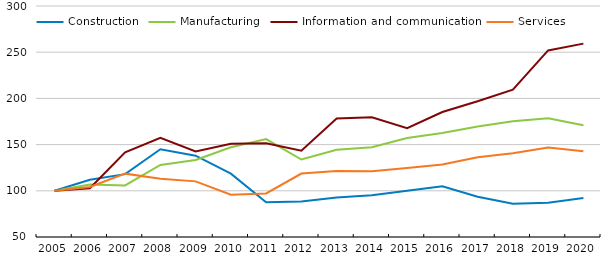
| Category | Construction | Manufacturing | Information and communication | Services |
|---|---|---|---|---|
| 2005.0 | 100 | 100 | 100 | 100 |
| 2006.0 | 111.855 | 106.706 | 102.7 | 104.203 |
| 2007.0 | 118.05 | 105.843 | 141.595 | 118.567 |
| 2008.0 | 144.94 | 128.044 | 157.216 | 112.927 |
| 2009.0 | 138.014 | 133.283 | 142.652 | 110.209 |
| 2010.0 | 118.536 | 147.108 | 150.834 | 95.745 |
| 2011.0 | 87.587 | 155.91 | 151.447 | 97.152 |
| 2012.0 | 88.317 | 133.821 | 143.475 | 118.692 |
| 2013.0 | 92.621 | 144.354 | 178.352 | 121.343 |
| 2014.0 | 95.27 | 147.149 | 179.638 | 121.152 |
| 2015.0 | 99.968 | 157.124 | 167.762 | 124.676 |
| 2016.0 | 104.847 | 162.647 | 185.314 | 128.529 |
| 2017.0 | 93.483 | 169.481 | 196.893 | 136.309 |
| 2018.0 | 85.88 | 175.207 | 209.468 | 140.527 |
| 2019.0 | 87.089 | 178.4 | 251.945 | 146.865 |
| 2020.0 | 92.165 | 171.015 | 259.297 | 142.901 |